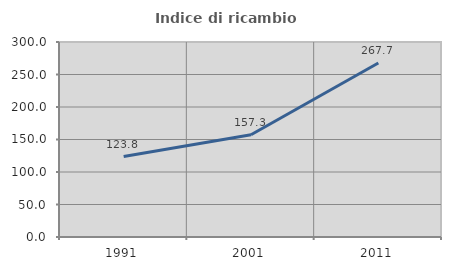
| Category | Indice di ricambio occupazionale  |
|---|---|
| 1991.0 | 123.771 |
| 2001.0 | 157.261 |
| 2011.0 | 267.662 |